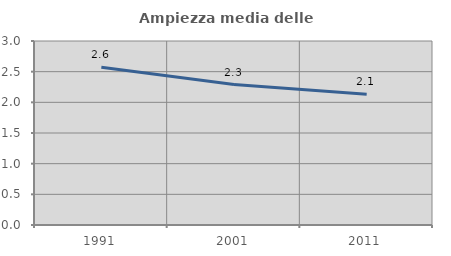
| Category | Ampiezza media delle famiglie |
|---|---|
| 1991.0 | 2.572 |
| 2001.0 | 2.291 |
| 2011.0 | 2.13 |